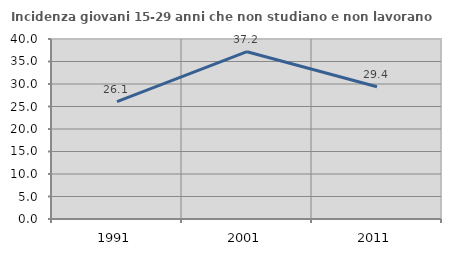
| Category | Incidenza giovani 15-29 anni che non studiano e non lavorano  |
|---|---|
| 1991.0 | 26.087 |
| 2001.0 | 37.174 |
| 2011.0 | 29.403 |